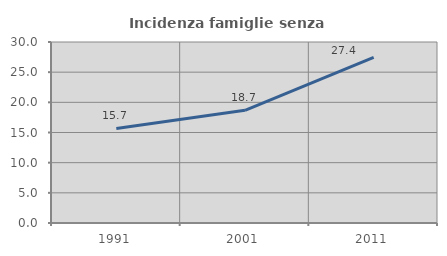
| Category | Incidenza famiglie senza nuclei |
|---|---|
| 1991.0 | 15.677 |
| 2001.0 | 18.681 |
| 2011.0 | 27.445 |